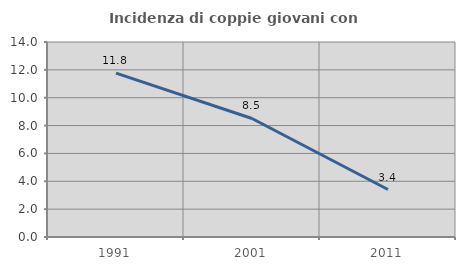
| Category | Incidenza di coppie giovani con figli |
|---|---|
| 1991.0 | 11.765 |
| 2001.0 | 8.511 |
| 2011.0 | 3.409 |